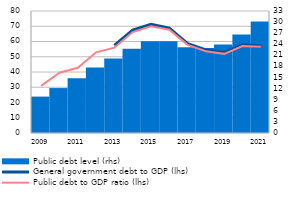
| Category | Public debt level (rhs) |
|---|---|
| 2009 | 9.849 |
| 2010 | 12.157 |
| 2011 | 14.789 |
| 2012 | 17.717 |
| 2013 | 20.141 |
| 2014 | 22.762 |
| 2015 | 24.819 |
| 2016 | 24.82 |
| 2017 | 23.222 |
| 2018 | 23.015 |
| 2019 | 23.944 |
| 2020 | 26.669 |
| 2021 | 30.134 |